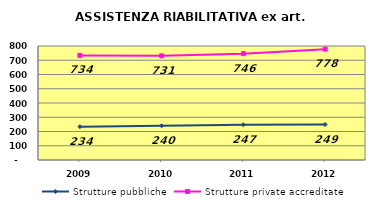
| Category | Strutture pubbliche | Strutture private accreditate |
|---|---|---|
| 2009.0 | 234 | 734 |
| 2010.0 | 240 | 731 |
| 2011.0 | 247 | 746 |
| 2012.0 | 249 | 778 |